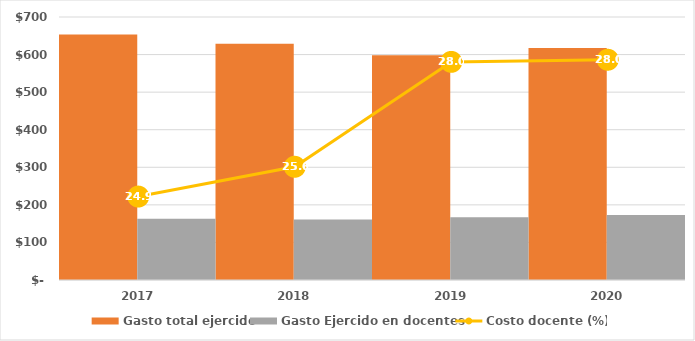
| Category | Gasto total ejercido | Gasto Ejercido en docentes |
|---|---|---|
| 2017 | 653670.792 | 162783.767 |
| 2018 | 628799.563 | 160863.176 |
| 2019 | 598040.902 | 167308.478 |
| 2020 | 617347.742 | 173008.939 |